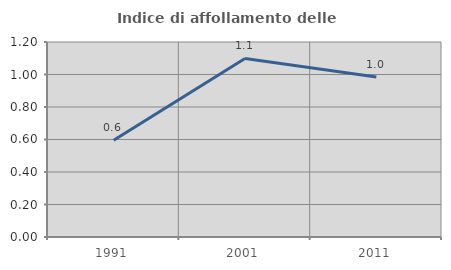
| Category | Indice di affollamento delle abitazioni  |
|---|---|
| 1991.0 | 0.595 |
| 2001.0 | 1.099 |
| 2011.0 | 0.985 |